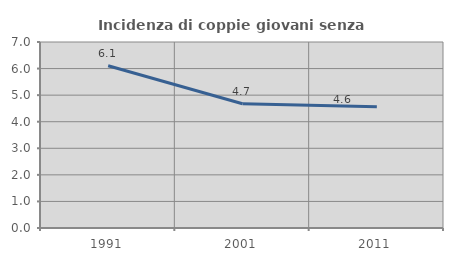
| Category | Incidenza di coppie giovani senza figli |
|---|---|
| 1991.0 | 6.108 |
| 2001.0 | 4.676 |
| 2011.0 | 4.56 |